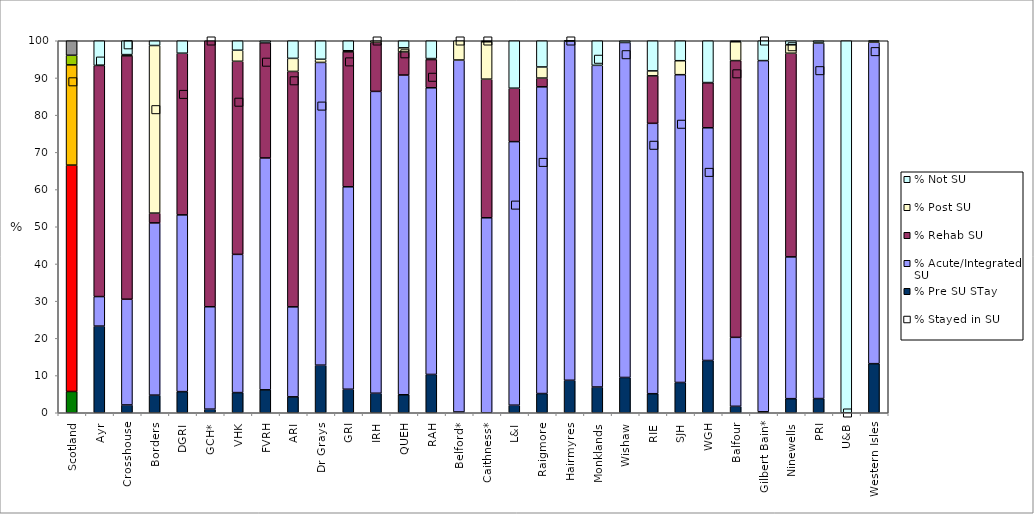
| Category | % Pre SU STay | % Acute/Integrated SU | % Rehab SU | % Post SU | % Not SU |
|---|---|---|---|---|---|
| Scotland | 5.72 | 60.851 | 26.947 | 2.583 | 3.899 |
| Ayr | 23.292 | 7.938 | 62.134 | 0 | 6.636 |
| Crosshouse | 2.096 | 28.425 | 65.425 | 0.329 | 3.725 |
| Borders | 4.739 | 46.297 | 2.635 | 45.054 | 1.276 |
| DGRI | 5.68 | 47.515 | 43.458 | 0 | 3.347 |
| GCH* | 0.967 | 27.529 | 71.504 | 0 | 0 |
| VHK | 5.422 | 37.156 | 51.904 | 2.971 | 2.548 |
| FVRH | 6.168 | 62.327 | 31.009 | 0.037 | 0.459 |
| ARI | 4.277 | 24.196 | 63.284 | 3.507 | 4.736 |
| Dr Grays | 12.796 | 81.374 | 0 | 0.853 | 4.976 |
| GRI | 6.323 | 54.421 | 36.278 | 0.294 | 2.684 |
| IRH | 5.249 | 81.135 | 13.163 | 0.453 | 0 |
| QUEH | 4.835 | 85.951 | 6.205 | 1.102 | 1.906 |
| RAH | 10.302 | 77.059 | 7.581 | 0.27 | 4.788 |
| Belford* | 0.207 | 94.617 | 0 | 5.176 | 0 |
| Caithness* | 0 | 52.413 | 37.265 | 10.054 | 0.268 |
| L&I | 2.036 | 70.847 | 14.362 | 0 | 12.755 |
| Raigmore | 5.162 | 82.452 | 2.355 | 2.984 | 7.047 |
| Hairmyres | 8.731 | 91.143 | 0 | 0.042 | 0.084 |
| Monklands | 6.919 | 86.472 | 0 | 0 | 6.61 |
| Wishaw | 9.485 | 90.066 | 0 | 0.015 | 0.434 |
| RIE | 5.124 | 72.678 | 12.768 | 1.336 | 8.094 |
| SJH | 8.144 | 82.734 | 0 | 3.756 | 5.366 |
| WGH | 14.052 | 62.553 | 12.139 | 0.018 | 11.238 |
| Balfour | 1.733 | 18.533 | 74.4 | 5.067 | 0.267 |
| Gilbert Bain* | 0.254 | 94.409 | 0 | 0 | 5.337 |
| Ninewells | 3.788 | 38.117 | 54.746 | 2.261 | 1.088 |
| PRI | 3.816 | 95.594 | 0 | 0.157 | 0.433 |
| U&B | 0 | 0 | 0 | 0 | 100 |
| Western Isles | 13.2 | 86.4 | 0 | 0.267 | 0.133 |